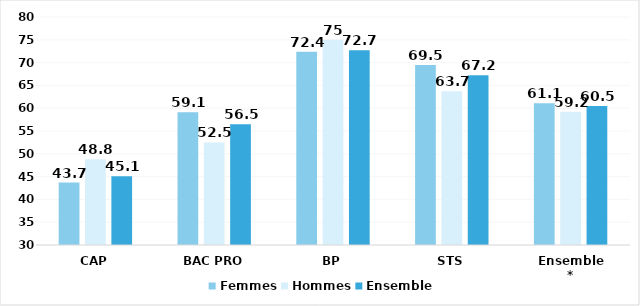
| Category | Femmes | Hommes | Ensemble |
|---|---|---|---|
| CAP | 43.7 | 48.8 | 45.1 |
| BAC PRO | 59.1 | 52.5 | 56.5 |
| BP | 72.4 | 75 | 72.7 |
| STS | 69.5 | 63.7 | 67.2 |
| Ensemble* | 61.1 | 59.2 | 60.5 |